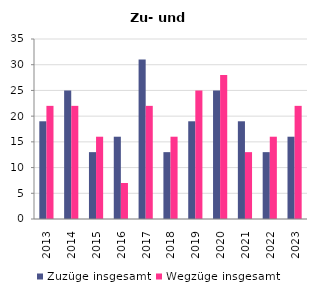
| Category | Zuzüge insgesamt | Wegzüge insgesamt |
|---|---|---|
| 2013.0 | 19 | 22 |
| 2014.0 | 25 | 22 |
| 2015.0 | 13 | 16 |
| 2016.0 | 16 | 7 |
| 2017.0 | 31 | 22 |
| 2018.0 | 13 | 16 |
| 2019.0 | 19 | 25 |
| 2020.0 | 25 | 28 |
| 2021.0 | 19 | 13 |
| 2022.0 | 13 | 16 |
| 2023.0 | 16 | 22 |